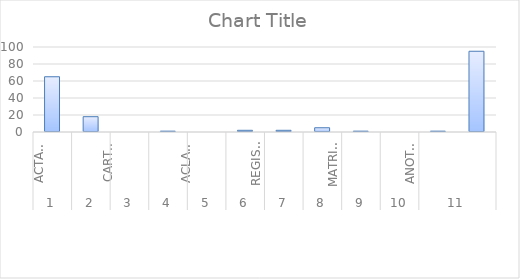
| Category | Series 0 |
|---|---|
| 0 | 65 |
| 1 | 18 |
| 2 | 0 |
| 3 | 1 |
| 4 | 0 |
| 5 | 2 |
| 6 | 2 |
| 7 | 5 |
| 8 | 1 |
| 9 | 0 |
| 10 | 1 |
| 11 | 95 |